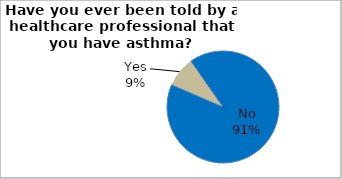
| Category | Series 0 |
|---|---|
| No | 91.195 |
| Yes | 8.805 |